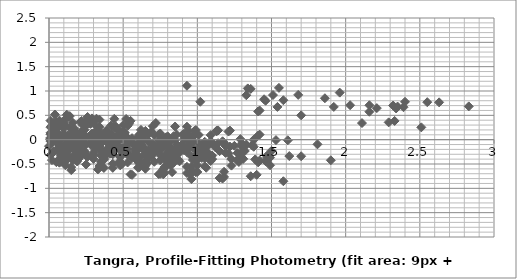
| Category | Series 0 |
|---|---|
| 0.1999999999999993 | -0.083 |
| 0.27999999999999936 | -0.086 |
| 0.3199999999999985 | 0.431 |
| 0.4299999999999997 | -0.094 |
| 0.4399999999999995 | 0.017 |
| 0.47999999999999865 | 0.004 |
| 0.48999999999999844 | 0.043 |
| 0.5 | 0.299 |
| 0.5099999999999998 | -0.017 |
| 0.5399999999999991 | 0.328 |
| 0.6199999999999992 | 0.036 |
| 0.6699999999999999 | 0.11 |
| 0.6699999999999999 | -0.023 |
| 0.7199999999999989 | 0.343 |
| 0.7999999999999989 | -0.024 |
| 0.8699999999999992 | -0.283 |
| 0.9099999999999984 | 0.011 |
| 0.9699999999999989 | -0.167 |
| 1.129999999999999 | 0.184 |
| 1.1499999999999986 | -0.237 |
| 1.25 | -0.127 |
| 1.2799999999999994 | -0.38 |
| 1.2899999999999991 | 0.011 |
| 1.3199999999999985 | -0.233 |
| 1.3699999999999992 | -0.116 |
| 1.379999999999999 | -0.146 |
| 1.4099999999999984 | 0.084 |
| 1.42 | 0.104 |
| 1.4699999999999989 | -0.359 |
| 1.4899999999999984 | -0.369 |
| 1.5 | -0.229 |
| 1.8099999999999987 | -0.095 |
| 1.8999999999999986 | -0.423 |
| 2.83 | 0.684 |
| 0.08000000000000007 | -0.003 |
| 0.11999999999999922 | 0.514 |
| 0.23000000000000043 | -0.011 |
| 0.2400000000000002 | 0.1 |
| 0.27999999999999936 | 0.087 |
| 0.28999999999999915 | 0.126 |
| 0.3000000000000007 | 0.382 |
| 0.3100000000000005 | 0.065 |
| 0.33999999999999986 | 0.411 |
| 0.41999999999999993 | 0.119 |
| 0.47000000000000064 | 0.193 |
| 0.47000000000000064 | 0.06 |
| 0.5199999999999996 | 0.425 |
| 0.5999999999999996 | 0.059 |
| 0.6699999999999999 | -0.2 |
| 0.7099999999999991 | 0.094 |
| 0.7699999999999996 | -0.084 |
| 0.9299999999999997 | 0.267 |
| 0.9499999999999993 | -0.154 |
| 1.0500000000000007 | -0.044 |
| 1.08 | -0.298 |
| 1.0899999999999999 | 0.094 |
| 1.1199999999999992 | -0.15 |
| 1.17 | -0.033 |
| 1.1799999999999997 | -0.063 |
| 1.209999999999999 | 0.167 |
| 1.2200000000000006 | 0.187 |
| 1.2699999999999996 | -0.276 |
| 1.2899999999999991 | -0.286 |
| 1.3000000000000007 | -0.146 |
| 1.6099999999999994 | -0.012 |
| 1.6999999999999993 | -0.341 |
| 2.630000000000001 | 0.767 |
| 0.03999999999999915 | 0.517 |
| 0.15000000000000036 | -0.008 |
| 0.16000000000000014 | 0.104 |
| 0.1999999999999993 | 0.09 |
| 0.20999999999999908 | 0.129 |
| 0.22000000000000064 | 0.385 |
| 0.23000000000000043 | 0.069 |
| 0.2599999999999998 | 0.415 |
| 0.33999999999999986 | 0.122 |
| 0.39000000000000057 | 0.196 |
| 0.39000000000000057 | 0.063 |
| 0.4399999999999995 | 0.429 |
| 0.5199999999999996 | 0.062 |
| 0.5899999999999999 | -0.196 |
| 0.629999999999999 | 0.097 |
| 0.6899999999999995 | -0.081 |
| 0.8499999999999996 | 0.27 |
| 0.8699999999999992 | -0.15 |
| 0.9700000000000006 | -0.04 |
| 1.0 | -0.294 |
| 1.0099999999999998 | 0.097 |
| 1.0399999999999991 | -0.147 |
| 1.0899999999999999 | -0.03 |
| 1.0999999999999996 | -0.06 |
| 1.129999999999999 | 0.171 |
| 1.1400000000000006 | 0.19 |
| 1.1899999999999995 | -0.272 |
| 1.209999999999999 | -0.282 |
| 1.2200000000000006 | -0.143 |
| 1.5299999999999994 | -0.009 |
| 1.6199999999999992 | -0.337 |
| 2.5500000000000007 | 0.77 |
| 0.11000000000000121 | -0.525 |
| 0.120000000000001 | -0.413 |
| 0.16000000000000014 | -0.427 |
| 0.16999999999999993 | -0.388 |
| 0.1800000000000015 | -0.132 |
| 0.19000000000000128 | -0.448 |
| 0.22000000000000064 | -0.103 |
| 0.3000000000000007 | -0.395 |
| 0.3500000000000014 | -0.321 |
| 0.3500000000000014 | -0.454 |
| 0.40000000000000036 | -0.088 |
| 0.4800000000000004 | -0.455 |
| 0.5500000000000007 | -0.713 |
| 0.5899999999999999 | -0.42 |
| 0.6500000000000004 | -0.598 |
| 0.8100000000000005 | -0.247 |
| 0.8300000000000001 | -0.667 |
| 0.9300000000000015 | -0.557 |
| 0.9600000000000009 | -0.811 |
| 0.9700000000000006 | -0.42 |
| 1.0 | -0.664 |
| 1.0500000000000007 | -0.547 |
| 1.0600000000000005 | -0.577 |
| 1.0899999999999999 | -0.346 |
| 1.1000000000000014 | -0.327 |
| 1.1500000000000004 | -0.789 |
| 1.17 | -0.799 |
| 1.1800000000000015 | -0.66 |
| 1.4900000000000002 | -0.526 |
| 1.58 | -0.854 |
| 2.5100000000000016 | 0.253 |
| 0.009999999999999787 | 0.112 |
| 0.049999999999998934 | 0.098 |
| 0.05999999999999872 | 0.137 |
| 0.07000000000000028 | 0.393 |
| 0.08000000000000007 | 0.077 |
| 0.10999999999999943 | 0.422 |
| 0.1899999999999995 | 0.13 |
| 0.2400000000000002 | 0.204 |
| 0.2400000000000002 | 0.071 |
| 0.28999999999999915 | 0.437 |
| 0.3699999999999992 | 0.07 |
| 0.4399999999999995 | -0.189 |
| 0.47999999999999865 | 0.105 |
| 0.5399999999999991 | -0.073 |
| 0.6999999999999993 | 0.278 |
| 0.7199999999999989 | -0.143 |
| 0.8200000000000003 | -0.032 |
| 0.8499999999999996 | -0.286 |
| 0.8599999999999994 | 0.105 |
| 0.8899999999999988 | -0.139 |
| 0.9399999999999995 | -0.022 |
| 0.9499999999999993 | -0.052 |
| 0.9799999999999986 | 0.178 |
| 0.9900000000000002 | 0.198 |
| 1.0399999999999991 | -0.264 |
| 1.0599999999999987 | -0.274 |
| 1.0700000000000003 | -0.135 |
| 1.379999999999999 | -0.001 |
| 1.4699999999999989 | -0.329 |
| 2.4000000000000004 | 0.778 |
| 0.03999999999999915 | -0.013 |
| 0.049999999999998934 | 0.025 |
| 0.0600000000000005 | 0.282 |
| 0.07000000000000028 | -0.035 |
| 0.09999999999999964 | 0.311 |
| 0.17999999999999972 | 0.018 |
| 0.23000000000000043 | 0.092 |
| 0.23000000000000043 | -0.041 |
| 0.27999999999999936 | 0.325 |
| 0.35999999999999943 | -0.041 |
| 0.4299999999999997 | -0.3 |
| 0.46999999999999886 | -0.006 |
| 0.5299999999999994 | -0.185 |
| 0.6899999999999995 | 0.166 |
| 0.7099999999999991 | -0.254 |
| 0.8100000000000005 | -0.144 |
| 0.8399999999999999 | -0.398 |
| 0.8499999999999996 | -0.006 |
| 0.879999999999999 | -0.25 |
| 0.9299999999999997 | -0.134 |
| 0.9399999999999995 | -0.163 |
| 0.9699999999999989 | 0.067 |
| 0.9800000000000004 | 0.086 |
| 1.0299999999999994 | -0.376 |
| 1.049999999999999 | -0.386 |
| 1.0600000000000005 | -0.246 |
| 1.3699999999999992 | -0.113 |
| 1.459999999999999 | -0.441 |
| 2.3900000000000006 | 0.667 |
| 0.009999999999999787 | 0.039 |
| 0.02000000000000135 | 0.295 |
| 0.030000000000001137 | -0.021 |
| 0.0600000000000005 | 0.324 |
| 0.14000000000000057 | 0.032 |
| 0.19000000000000128 | 0.106 |
| 0.19000000000000128 | -0.027 |
| 0.2400000000000002 | 0.339 |
| 0.3200000000000003 | -0.028 |
| 0.39000000000000057 | -0.287 |
| 0.4299999999999997 | 0.007 |
| 0.4900000000000002 | -0.171 |
| 0.6500000000000004 | 0.18 |
| 0.6699999999999999 | -0.241 |
| 0.7700000000000014 | -0.131 |
| 0.8000000000000007 | -0.385 |
| 0.8100000000000005 | 0.007 |
| 0.8399999999999999 | -0.237 |
| 0.8900000000000006 | -0.12 |
| 0.9000000000000004 | -0.15 |
| 0.9299999999999997 | 0.08 |
| 0.9400000000000013 | 0.1 |
| 0.9900000000000002 | -0.363 |
| 1.0099999999999998 | -0.373 |
| 1.0200000000000014 | -0.233 |
| 1.33 | -0.099 |
| 1.42 | -0.428 |
| 2.3500000000000014 | 0.68 |
| 0.010000000000001563 | 0.256 |
| 0.02000000000000135 | -0.06 |
| 0.05000000000000071 | 0.285 |
| 0.13000000000000078 | -0.007 |
| 0.1800000000000015 | 0.067 |
| 0.1800000000000015 | -0.066 |
| 0.23000000000000043 | 0.3 |
| 0.3100000000000005 | -0.067 |
| 0.3800000000000008 | -0.326 |
| 0.41999999999999993 | -0.032 |
| 0.4800000000000004 | -0.21 |
| 0.6400000000000006 | 0.141 |
| 0.6600000000000001 | -0.28 |
| 0.7600000000000016 | -0.169 |
| 0.7900000000000009 | -0.423 |
| 0.8000000000000007 | -0.032 |
| 0.8300000000000001 | -0.276 |
| 0.8800000000000008 | -0.159 |
| 0.8900000000000006 | -0.189 |
| 0.9199999999999999 | 0.041 |
| 0.9300000000000015 | 0.061 |
| 0.9800000000000004 | -0.401 |
| 1.0 | -0.411 |
| 1.0100000000000016 | -0.272 |
| 1.3200000000000003 | -0.138 |
| 1.4100000000000001 | -0.466 |
| 2.3400000000000016 | 0.641 |
| 0.009999999999999787 | -0.316 |
| 0.03999999999999915 | 0.029 |
| 0.11999999999999922 | -0.263 |
| 0.16999999999999993 | -0.189 |
| 0.16999999999999993 | -0.322 |
| 0.21999999999999886 | 0.044 |
| 0.29999999999999893 | -0.323 |
| 0.3699999999999992 | -0.582 |
| 0.40999999999999837 | -0.288 |
| 0.46999999999999886 | -0.466 |
| 0.629999999999999 | -0.115 |
| 0.6499999999999986 | -0.536 |
| 0.75 | -0.426 |
| 0.7799999999999994 | -0.679 |
| 0.7899999999999991 | -0.288 |
| 0.8199999999999985 | -0.532 |
| 0.8699999999999992 | -0.415 |
| 0.879999999999999 | -0.445 |
| 0.9099999999999984 | -0.215 |
| 0.9199999999999999 | -0.195 |
| 0.9699999999999989 | -0.658 |
| 0.9899999999999984 | -0.668 |
| 1.0 | -0.528 |
| 1.3099999999999987 | -0.394 |
| 1.3999999999999986 | -0.722 |
| 2.33 | 0.385 |
| 0.02999999999999936 | 0.346 |
| 0.10999999999999943 | 0.053 |
| 0.16000000000000014 | 0.127 |
| 0.16000000000000014 | -0.006 |
| 0.20999999999999908 | 0.36 |
| 0.28999999999999915 | -0.007 |
| 0.35999999999999943 | -0.265 |
| 0.3999999999999986 | 0.029 |
| 0.4599999999999991 | -0.15 |
| 0.6199999999999992 | 0.201 |
| 0.6399999999999988 | -0.219 |
| 0.7400000000000002 | -0.109 |
| 0.7699999999999996 | -0.363 |
| 0.7799999999999994 | 0.029 |
| 0.8099999999999987 | -0.216 |
| 0.8599999999999994 | -0.099 |
| 0.8699999999999992 | -0.129 |
| 0.8999999999999986 | 0.102 |
| 0.9100000000000001 | 0.121 |
| 0.9599999999999991 | -0.341 |
| 0.9799999999999986 | -0.351 |
| 0.9900000000000002 | -0.211 |
| 1.299999999999999 | -0.078 |
| 1.3899999999999988 | -0.406 |
| 2.3200000000000003 | 0.701 |
| 0.08000000000000007 | -0.292 |
| 0.13000000000000078 | -0.218 |
| 0.13000000000000078 | -0.351 |
| 0.17999999999999972 | 0.014 |
| 0.2599999999999998 | -0.352 |
| 0.33000000000000007 | -0.611 |
| 0.3699999999999992 | -0.317 |
| 0.4299999999999997 | -0.495 |
| 0.5899999999999999 | -0.144 |
| 0.6099999999999994 | -0.565 |
| 0.7100000000000009 | -0.455 |
| 0.7400000000000002 | -0.709 |
| 0.75 | -0.317 |
| 0.7799999999999994 | -0.561 |
| 0.8300000000000001 | -0.444 |
| 0.8399999999999999 | -0.474 |
| 0.8699999999999992 | -0.244 |
| 0.8800000000000008 | -0.224 |
| 0.9299999999999997 | -0.687 |
| 0.9499999999999993 | -0.697 |
| 0.9600000000000009 | -0.557 |
| 1.2699999999999996 | -0.424 |
| 1.3599999999999994 | -0.752 |
| 2.290000000000001 | 0.356 |
| 0.05000000000000071 | 0.074 |
| 0.05000000000000071 | -0.059 |
| 0.09999999999999964 | 0.307 |
| 0.17999999999999972 | -0.06 |
| 0.25 | -0.318 |
| 0.28999999999999915 | -0.025 |
| 0.34999999999999964 | -0.203 |
| 0.5099999999999998 | 0.148 |
| 0.5299999999999994 | -0.272 |
| 0.6300000000000008 | -0.162 |
| 0.6600000000000001 | -0.416 |
| 0.6699999999999999 | -0.025 |
| 0.6999999999999993 | -0.269 |
| 0.75 | -0.152 |
| 0.7599999999999998 | -0.182 |
| 0.7899999999999991 | 0.049 |
| 0.8000000000000007 | 0.068 |
| 0.8499999999999996 | -0.394 |
| 0.8699999999999992 | -0.404 |
| 0.8800000000000008 | -0.265 |
| 1.1899999999999995 | -0.131 |
| 1.2799999999999994 | -0.459 |
| 2.210000000000001 | 0.648 |
| 0.0 | -0.133 |
| 0.049999999999998934 | 0.233 |
| 0.129999999999999 | -0.134 |
| 0.1999999999999993 | -0.393 |
| 0.23999999999999844 | -0.099 |
| 0.29999999999999893 | -0.277 |
| 0.4599999999999991 | 0.074 |
| 0.47999999999999865 | -0.346 |
| 0.5800000000000001 | -0.236 |
| 0.6099999999999994 | -0.49 |
| 0.6199999999999992 | -0.099 |
| 0.6499999999999986 | -0.343 |
| 0.6999999999999993 | -0.226 |
| 0.7099999999999991 | -0.256 |
| 0.7399999999999984 | -0.025 |
| 0.75 | -0.006 |
| 0.7999999999999989 | -0.468 |
| 0.8199999999999985 | -0.478 |
| 0.8300000000000001 | -0.339 |
| 1.1399999999999988 | -0.205 |
| 1.2299999999999986 | -0.533 |
| 2.16 | 0.574 |
| 0.049999999999998934 | 0.366 |
| 0.129999999999999 | -0.001 |
| 0.1999999999999993 | -0.26 |
| 0.23999999999999844 | 0.034 |
| 0.29999999999999893 | -0.144 |
| 0.4599999999999991 | 0.207 |
| 0.47999999999999865 | -0.213 |
| 0.5800000000000001 | -0.103 |
| 0.6099999999999994 | -0.357 |
| 0.6199999999999992 | 0.034 |
| 0.6499999999999986 | -0.21 |
| 0.6999999999999993 | -0.093 |
| 0.7099999999999991 | -0.123 |
| 0.7399999999999984 | 0.108 |
| 0.75 | 0.127 |
| 0.7999999999999989 | -0.335 |
| 0.8199999999999985 | -0.345 |
| 0.8300000000000001 | -0.206 |
| 1.1399999999999988 | -0.072 |
| 1.2299999999999986 | -0.4 |
| 2.16 | 0.707 |
| 0.08000000000000007 | -0.367 |
| 0.15000000000000036 | -0.625 |
| 0.1899999999999995 | -0.331 |
| 0.25 | -0.51 |
| 0.41000000000000014 | -0.159 |
| 0.4299999999999997 | -0.579 |
| 0.5300000000000011 | -0.469 |
| 0.5600000000000005 | -0.723 |
| 0.5700000000000003 | -0.331 |
| 0.5999999999999996 | -0.576 |
| 0.6500000000000004 | -0.459 |
| 0.6600000000000001 | -0.489 |
| 0.6899999999999995 | -0.258 |
| 0.7000000000000011 | -0.239 |
| 0.75 | -0.701 |
| 0.7699999999999996 | -0.711 |
| 0.7800000000000011 | -0.572 |
| 1.0899999999999999 | -0.438 |
| 1.1799999999999997 | -0.766 |
| 2.110000000000001 | 0.341 |
| 0.07000000000000028 | -0.259 |
| 0.10999999999999943 | 0.035 |
| 0.16999999999999993 | -0.143 |
| 0.33000000000000007 | 0.208 |
| 0.34999999999999964 | -0.213 |
| 0.45000000000000107 | -0.102 |
| 0.4800000000000004 | -0.356 |
| 0.4900000000000002 | 0.035 |
| 0.5199999999999996 | -0.209 |
| 0.5700000000000003 | -0.092 |
| 0.5800000000000001 | -0.122 |
| 0.6099999999999994 | 0.108 |
| 0.620000000000001 | 0.128 |
| 0.6699999999999999 | -0.335 |
| 0.6899999999999995 | -0.345 |
| 0.7000000000000011 | -0.205 |
| 1.0099999999999998 | -0.071 |
| 1.0999999999999996 | -0.399 |
| 2.030000000000001 | 0.708 |
| 0.03999999999999915 | 0.294 |
| 0.09999999999999964 | 0.116 |
| 0.2599999999999998 | 0.467 |
| 0.27999999999999936 | 0.046 |
| 0.3800000000000008 | 0.156 |
| 0.41000000000000014 | -0.098 |
| 0.41999999999999993 | 0.294 |
| 0.4499999999999993 | 0.05 |
| 0.5 | 0.166 |
| 0.5099999999999998 | 0.137 |
| 0.5399999999999991 | 0.367 |
| 0.5500000000000007 | 0.387 |
| 0.5999999999999996 | -0.076 |
| 0.6199999999999992 | -0.086 |
| 0.6300000000000008 | 0.054 |
| 0.9399999999999995 | 0.187 |
| 1.0299999999999994 | -0.141 |
| 1.9600000000000009 | 0.967 |
| 0.0600000000000005 | -0.178 |
| 0.22000000000000064 | 0.173 |
| 0.2400000000000002 | -0.248 |
| 0.34000000000000163 | -0.138 |
| 0.370000000000001 | -0.392 |
| 0.3800000000000008 | 0 |
| 0.41000000000000014 | -0.244 |
| 0.46000000000000085 | -0.127 |
| 0.47000000000000064 | -0.157 |
| 0.5 | 0.073 |
| 0.5100000000000016 | 0.093 |
| 0.5600000000000005 | -0.37 |
| 0.5800000000000001 | -0.38 |
| 0.5900000000000016 | -0.24 |
| 0.9000000000000004 | -0.106 |
| 0.9900000000000002 | -0.435 |
| 1.9200000000000017 | 0.673 |
| 0.16000000000000014 | 0.351 |
| 0.17999999999999972 | -0.07 |
| 0.28000000000000114 | 0.041 |
| 0.3100000000000005 | -0.213 |
| 0.3200000000000003 | 0.178 |
| 0.34999999999999964 | -0.066 |
| 0.40000000000000036 | 0.051 |
| 0.41000000000000014 | 0.021 |
| 0.4399999999999995 | 0.251 |
| 0.45000000000000107 | 0.271 |
| 0.5 | -0.191 |
| 0.5199999999999996 | -0.202 |
| 0.5300000000000011 | -0.062 |
| 0.8399999999999999 | 0.072 |
| 0.9299999999999997 | -0.256 |
| 1.8600000000000012 | 0.851 |
| 0.019999999999999574 | -0.421 |
| 0.120000000000001 | -0.31 |
| 0.15000000000000036 | -0.564 |
| 0.16000000000000014 | -0.173 |
| 0.1899999999999995 | -0.417 |
| 0.2400000000000002 | -0.3 |
| 0.25 | -0.33 |
| 0.27999999999999936 | -0.1 |
| 0.2900000000000009 | -0.08 |
| 0.33999999999999986 | -0.543 |
| 0.35999999999999943 | -0.553 |
| 0.370000000000001 | -0.413 |
| 0.6799999999999997 | -0.279 |
| 0.7699999999999996 | -0.607 |
| 1.700000000000001 | 0.5 |
| 0.10000000000000142 | 0.11 |
| 0.13000000000000078 | -0.144 |
| 0.14000000000000057 | 0.248 |
| 0.16999999999999993 | 0.004 |
| 0.22000000000000064 | 0.12 |
| 0.23000000000000043 | 0.091 |
| 0.2599999999999998 | 0.321 |
| 0.27000000000000135 | 0.341 |
| 0.3200000000000003 | -0.122 |
| 0.33999999999999986 | -0.132 |
| 0.3500000000000014 | 0.008 |
| 0.6600000000000001 | 0.141 |
| 0.75 | -0.187 |
| 1.6800000000000015 | 0.921 |
| 0.02999999999999936 | -0.254 |
| 0.03999999999999915 | 0.138 |
| 0.06999999999999851 | -0.106 |
| 0.11999999999999922 | 0.01 |
| 0.129999999999999 | -0.02 |
| 0.15999999999999837 | 0.211 |
| 0.16999999999999993 | 0.23 |
| 0.21999999999999886 | -0.232 |
| 0.23999999999999844 | -0.242 |
| 0.25 | -0.102 |
| 0.5599999999999987 | 0.031 |
| 0.6499999999999986 | -0.297 |
| 1.58 | 0.811 |
| 0.009999999999999787 | 0.392 |
| 0.03999999999999915 | 0.147 |
| 0.08999999999999986 | 0.264 |
| 0.09999999999999964 | 0.234 |
| 0.129999999999999 | 0.465 |
| 0.14000000000000057 | 0.484 |
| 0.1899999999999995 | 0.022 |
| 0.20999999999999908 | 0.012 |
| 0.22000000000000064 | 0.152 |
| 0.5299999999999994 | 0.285 |
| 0.6199999999999992 | -0.043 |
| 1.5500000000000007 | 1.064 |
| 0.02999999999999936 | -0.244 |
| 0.08000000000000007 | -0.127 |
| 0.08999999999999986 | -0.157 |
| 0.11999999999999922 | 0.073 |
| 0.13000000000000078 | 0.093 |
| 0.17999999999999972 | -0.37 |
| 0.1999999999999993 | -0.38 |
| 0.21000000000000085 | -0.24 |
| 0.5199999999999996 | -0.106 |
| 0.6099999999999994 | -0.435 |
| 1.540000000000001 | 0.673 |
| 0.05000000000000071 | 0.117 |
| 0.0600000000000005 | 0.087 |
| 0.08999999999999986 | 0.317 |
| 0.10000000000000142 | 0.337 |
| 0.15000000000000036 | -0.126 |
| 0.16999999999999993 | -0.136 |
| 0.1800000000000015 | 0.004 |
| 0.4900000000000002 | 0.138 |
| 0.5800000000000001 | -0.191 |
| 1.5100000000000016 | 0.917 |
| 0.009999999999999787 | -0.03 |
| 0.03999999999999915 | 0.201 |
| 0.05000000000000071 | 0.22 |
| 0.09999999999999964 | -0.242 |
| 0.11999999999999922 | -0.252 |
| 0.13000000000000078 | -0.113 |
| 0.4399999999999995 | 0.021 |
| 0.5299999999999994 | -0.307 |
| 1.4600000000000009 | 0.8 |
| 0.02999999999999936 | 0.23 |
| 0.040000000000000924 | 0.25 |
| 0.08999999999999986 | -0.213 |
| 0.10999999999999943 | -0.223 |
| 0.120000000000001 | -0.083 |
| 0.4299999999999997 | 0.051 |
| 0.5199999999999996 | -0.277 |
| 1.450000000000001 | 0.83 |
| 0.010000000000001563 | 0.02 |
| 0.0600000000000005 | -0.443 |
| 0.08000000000000007 | -0.453 |
| 0.09000000000000163 | -0.313 |
| 0.40000000000000036 | -0.18 |
| 0.4900000000000002 | -0.508 |
| 1.4200000000000017 | 0.6 |
| 0.049999999999998934 | -0.462 |
| 0.06999999999999851 | -0.472 |
| 0.08000000000000007 | -0.333 |
| 0.3899999999999988 | -0.199 |
| 0.47999999999999865 | -0.527 |
| 1.4100000000000001 | 0.58 |
| 0.019999999999999574 | -0.01 |
| 0.030000000000001137 | 0.13 |
| 0.33999999999999986 | 0.263 |
| 0.4299999999999997 | -0.065 |
| 1.3600000000000012 | 1.043 |
| 0.010000000000001563 | 0.14 |
| 0.3200000000000003 | 0.273 |
| 0.41000000000000014 | -0.055 |
| 1.3400000000000016 | 1.053 |
| 0.3099999999999987 | 0.134 |
| 0.3999999999999986 | -0.195 |
| 1.33 | 0.913 |
| 0.08999999999999986 | -0.328 |
| 1.0200000000000014 | 0.779 |
| 0.9300000000000015 | 1.107 |